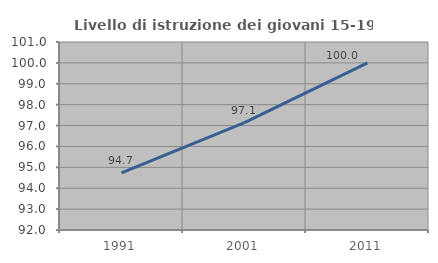
| Category | Livello di istruzione dei giovani 15-19 anni |
|---|---|
| 1991.0 | 94.737 |
| 2001.0 | 97.143 |
| 2011.0 | 100 |